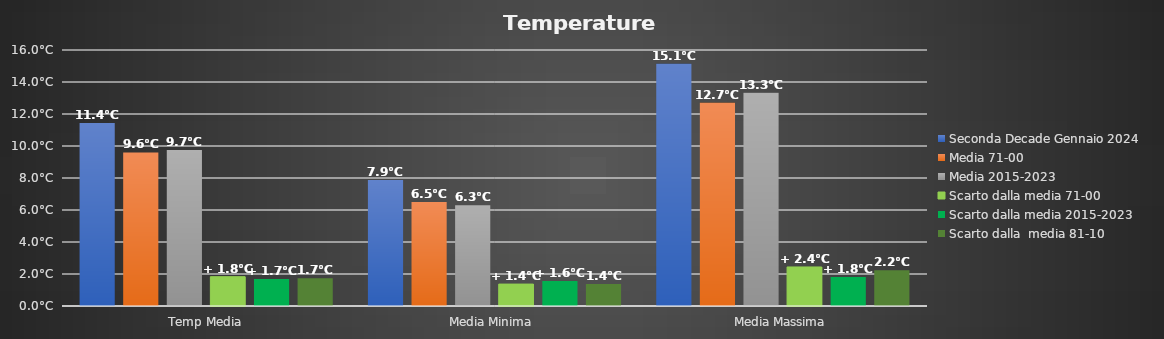
| Category | Seconda Decade Gennaio 2024 | Media 71-00 | Media 2015-2023 | Scarto dalla media 71-00 | Scarto dalla media 2015-2023 | Scarto dalla  media 81-10 |
|---|---|---|---|---|---|---|
| Temp Media | 11.433 | 9.6 | 9.742 | 1.833 | 1.691 | 1.733 |
| Media Minima  | 7.87 | 6.5 | 6.3 | 1.37 | 1.57 | 1.37 |
| Media Massima | 15.14 | 12.7 | 13.326 | 2.44 | 1.814 | 2.24 |